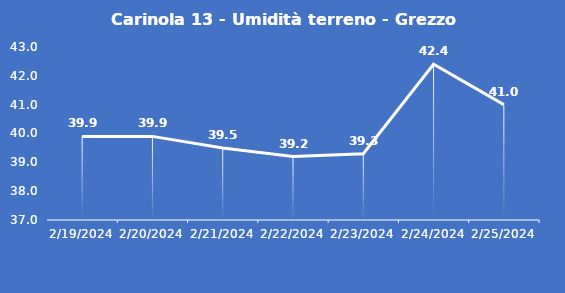
| Category | Carinola 13 - Umidità terreno - Grezzo (%VWC) |
|---|---|
| 2/19/24 | 39.9 |
| 2/20/24 | 39.9 |
| 2/21/24 | 39.5 |
| 2/22/24 | 39.2 |
| 2/23/24 | 39.3 |
| 2/24/24 | 42.4 |
| 2/25/24 | 41 |